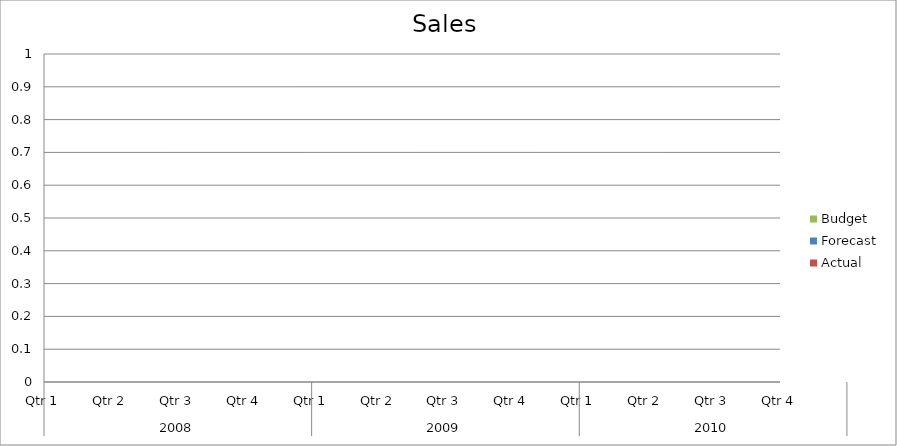
| Category | Budget | Forecast | Actual |
|---|---|---|---|
| 0 | 3500 | 870 | 2860 |
| 1 | 3080 | 3120 | 1820 |
| 2 | 3430 | 2300 | 3190 |
| 3 | 2460 | 1070 | 2850 |
| 4 | 2230 | 1240 | 930 |
| 5 | 780 | 1250 | 1940 |
| 6 | 2170 | 530 | 1490 |
| 7 | 2200 | 2460 | 700 |
| 8 | 2120 | 1230 | 2410 |
| 9 | 1060 | 2140 | 3360 |
| 10 | 830 | 2050 | 2140 |
| 11 | 1070 | 3290 | 1140 |